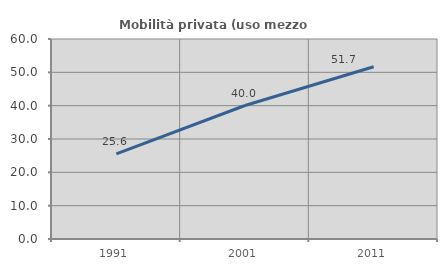
| Category | Mobilità privata (uso mezzo privato) |
|---|---|
| 1991.0 | 25.55 |
| 2001.0 | 40.05 |
| 2011.0 | 51.669 |